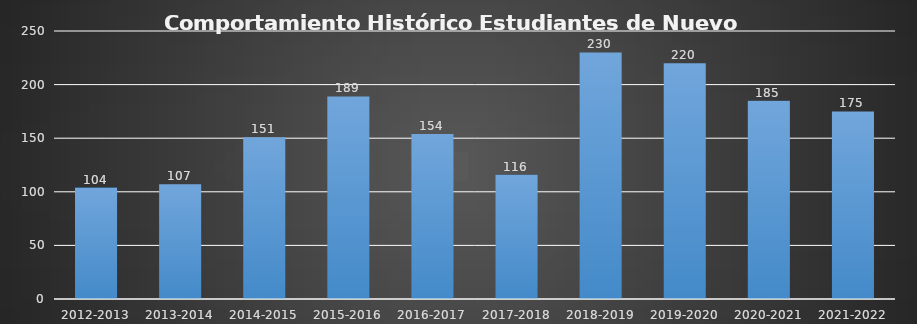
| Category | Series 0 |
|---|---|
| 2012-2013 | 104 |
| 2013-2014 | 107 |
| 2014-2015 | 151 |
| 2015-2016 | 189 |
| 2016-2017 | 154 |
| 2017-2018 | 116 |
| 2018-2019 | 230 |
| 2019-2020 | 220 |
| 2020-2021 | 185 |
| 2021-2022 | 175 |